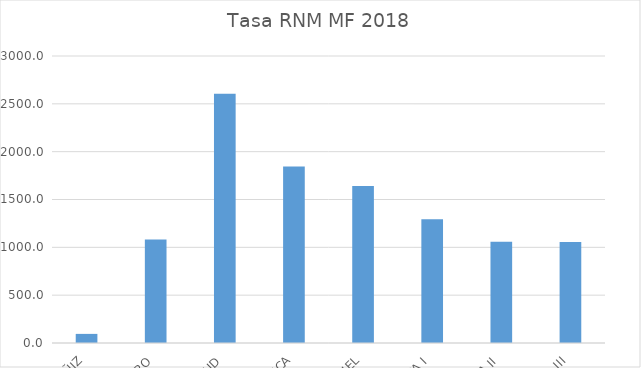
| Category | 1sem 2018 |
|---|---|
| ALCAÑIZ | 95.244 |
| BARBASTRO | 1082.52 |
| CALATAYUD | 2605.595 |
| HUESCA | 1846.013 |
| TERUEL | 1642.271 |
| ZARAGOZA I | 1292.879 |
| ZARAGOZA II | 1059.121 |
| ZARAGOZA III | 1054.775 |